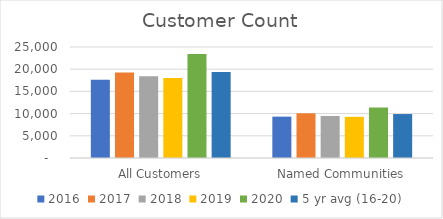
| Category | 2016 | 2017 | 2018 | 2019 | 2020 | 5 yr avg (16-20) |
|---|---|---|---|---|---|---|
|  All Customers  | 17642 | 19284 | 18431 | 18030 | 23446 | 19366.6 |
|  Named Communities  | 9317 | 10069 | 9467 | 9271 | 11373 | 9899.4 |